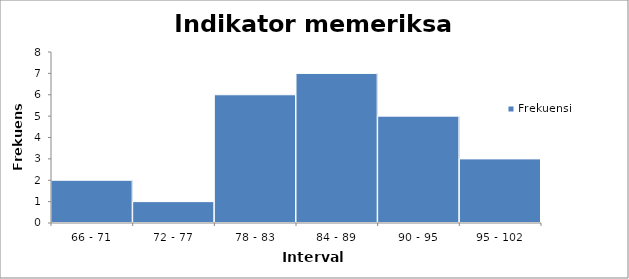
| Category | Frekuensi |
|---|---|
| 66 - 71 | 2 |
| 72 - 77 | 1 |
| 78 - 83 | 6 |
| 84 - 89 | 7 |
| 90 - 95 | 5 |
| 95 - 102 | 3 |